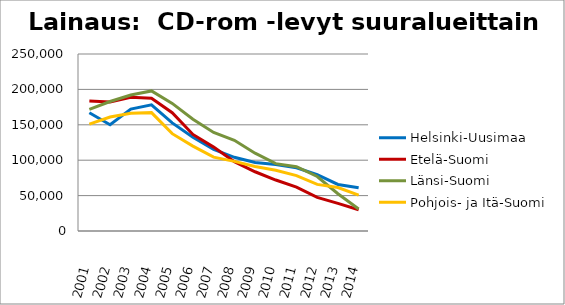
| Category | Helsinki-Uusimaa | Etelä-Suomi | Länsi-Suomi | Pohjois- ja Itä-Suomi |
|---|---|---|---|---|
| 2001.0 | 167047 | 183576 | 171712 | 150953 |
| 2002.0 | 150151 | 182378 | 182899 | 161025 |
| 2003.0 | 172183 | 188767 | 192157 | 166336 |
| 2004.0 | 178304 | 187502 | 197804 | 167178 |
| 2005.0 | 152687 | 167102 | 180247 | 137465 |
| 2006.0 | 132513 | 136376 | 157836 | 119886 |
| 2007.0 | 115134 | 118481 | 139142 | 104338 |
| 2008.0 | 104056 | 97987 | 128117 | 98384 |
| 2009.0 | 96765 | 83673 | 109918 | 91152 |
| 2010.0 | 93910 | 71974 | 95173 | 85769 |
| 2011.0 | 89284 | 62025 | 90780 | 78272 |
| 2012.0 | 79654 | 47562 | 76954 | 65805 |
| 2013.0 | 65775 | 39061 | 52633 | 61459 |
| 2014.0 | 60980 | 30003 | 31107 | 50666 |